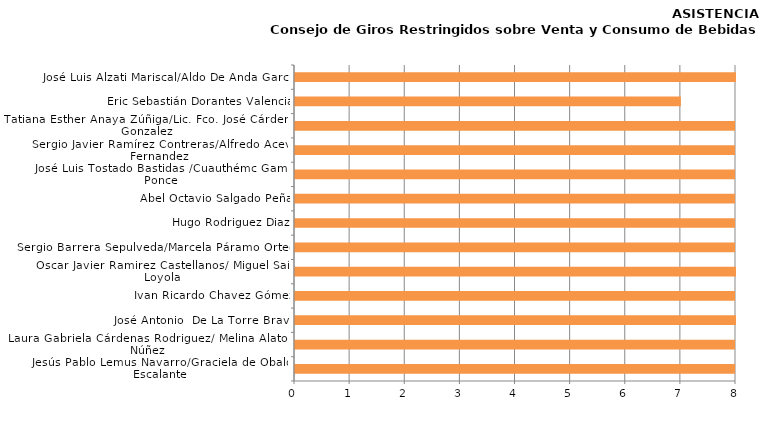
| Category | Series 0 |
|---|---|
| Jesús Pablo Lemus Navarro/Graciela de Obaldía Escalante | 10 |
| Laura Gabriela Cárdenas Rodriguez/ Melina Alatorre Núñez | 10 |
| José Antonio  De La Torre Bravo | 8 |
| Ivan Ricardo Chavez Gómez | 9 |
| Oscar Javier Ramirez Castellanos/ Miguel Saínz Loyola | 8 |
| Sergio Barrera Sepulveda/Marcela Páramo Ortega | 9 |
| Hugo Rodriguez Diaz | 9 |
| Abel Octavio Salgado Peña | 9 |
| José Luis Tostado Bastidas /Cuauthémc Gamez Ponce | 9 |
| Sergio Javier Ramírez Contreras/Alfredo Aceves Fernandez | 10 |
| Tatiana Esther Anaya Zúñiga/Lic. Fco. José Cárdenas Gonzalez | 10 |
| Eric Sebastián Dorantes Valencia | 7 |
| José Luis Alzati Mariscal/Aldo De Anda García | 8 |